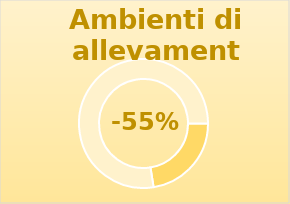
| Category | Series 0 |
|---|---|
| 0 | 0.45 |
| 1 | 1.55 |